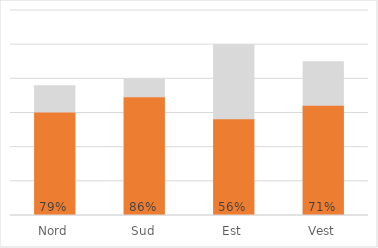
| Category | Target | Realizat | Procentaj |
|---|---|---|---|
| Nord | 380000 | 300000 | 0.789 |
| Sud | 400000 | 345000 | 0.862 |
| Est | 500000 | 280000 | 0.56 |
| Vest | 450000 | 320000 | 0.711 |